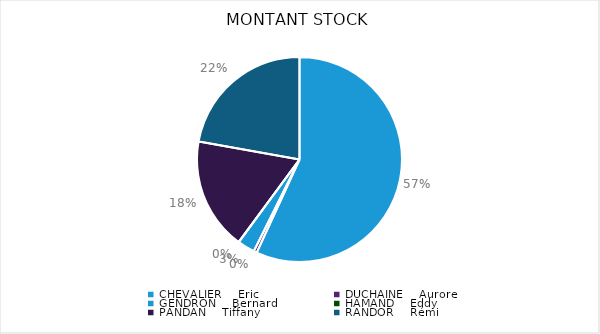
| Category | Montant Stock |
|---|---|
| CHEVALIER    Eric | 37526.5 |
| DUCHAINE    Aurore | 328.65 |
| GENDRON    Bernard | -1801.6 |
| HAMAND    Eddy | -21.6 |
| PANDAN    Tiffany | -11687.32 |
| RANDOR    Rémi | -14636.53 |